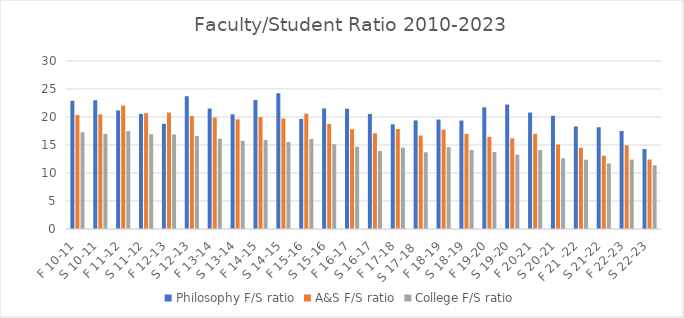
| Category | Philosophy F/S ratio | A&S F/S ratio | College F/S ratio |
|---|---|---|---|
| F 10-11 | 22.88 | 20.37 | 17.28 |
| S 10-11 | 22.99 | 20.48 | 16.99 |
| F 11-12 | 21.17 | 22.06 | 17.5 |
| S 11-12 | 20.56 | 20.69 | 16.93 |
| F 12-13 | 18.78 | 20.8 | 16.9 |
| S 12-13 | 23.72 | 20.18 | 16.59 |
| F 13-14 | 21.51 | 19.91 | 16.11 |
| S 13-14 | 20.48 | 19.58 | 15.74 |
| F 14-15 | 23.03 | 19.98 | 15.91 |
| S 14-15 | 24.22 | 19.72 | 15.54 |
| F 15-16 | 19.66 | 20.59 | 16.08 |
| S 15-16 | 21.54 | 18.74 | 15.13 |
| F 16-17 | 21.47 | 17.83 | 14.69 |
| S 16-17 | 20.55 | 17.09 | 13.94 |
| F 17-18 | 18.69 | 17.86 | 14.54 |
| S 17-18  | 19.39 | 16.69 | 13.71 |
| F 18-19 | 19.55 | 17.73 | 14.62 |
| S 18-19 | 19.37 | 16.98 | 14.12 |
| F 19-20 | 21.72 | 16.46 | 13.74 |
| S 19-20 | 22.23 | 16.18 | 13.27 |
| F 20-21 | 20.8 | 17.01 | 14.1 |
| S 20-21 | 20.22 | 15.11 | 12.62 |
| F 21 -22 | 18.31 | 14.52 | 12.38 |
| S 21-22 | 18.17 | 13.08 | 11.7 |
| F 22-23 | 17.5 | 14.94 | 12.39 |
| S 22-23 | 14.29 | 12.41 | 11.39 |